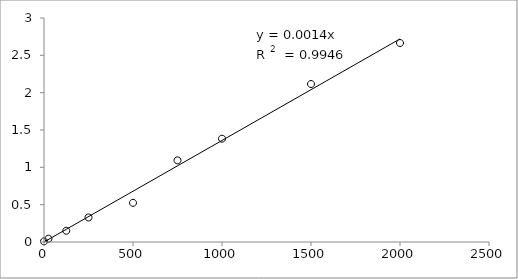
| Category | Series 0 |
|---|---|
| 2000.0 | 2.665 |
| 1500.0 | 2.116 |
| 1000.0 | 1.384 |
| 750.0 | 1.093 |
| 500.0 | 0.524 |
| 250.0 | 0.328 |
| 125.0 | 0.151 |
| 25.0 | 0.044 |
| 0.0 | 0.008 |